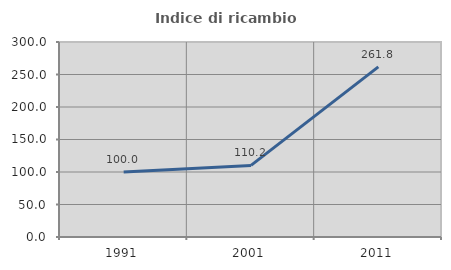
| Category | Indice di ricambio occupazionale  |
|---|---|
| 1991.0 | 100 |
| 2001.0 | 110.169 |
| 2011.0 | 261.765 |